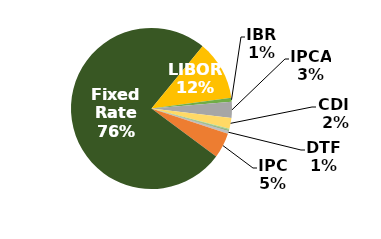
| Category | Series 0 |
|---|---|
| DTF | 0.006 |
| IPC | 0.051 |
| Fixed Rate | 0.758 |
| LIBOR | 0.119 |
| IBR | 0.008 |
| IPCA | 0.032 |
| CDI  | 0.022 |
| TJLP  | 0.003 |
| TAB | 0.001 |